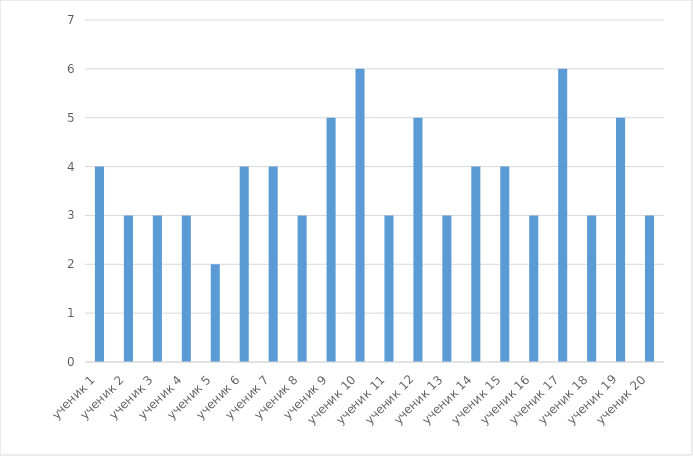
| Category | Series 0 |
|---|---|
| ученик 1 | 4 |
| ученик 2 | 3 |
| ученик 3 | 3 |
| ученик 4 | 3 |
| ученик 5 | 2 |
| ученик 6 | 4 |
| ученик 7 | 4 |
| ученик 8 | 3 |
| ученик 9 | 5 |
| ученик 10 | 6 |
| ученик 11 | 3 |
|  ученик 12 | 5 |
| ученик 13 | 3 |
| ученик 14 | 4 |
| ученик 15 | 4 |
| ученик 16 | 3 |
| ученик 17 | 6 |
| ученик 18 | 3 |
|  ученик 19 | 5 |
| ученик 20 | 3 |